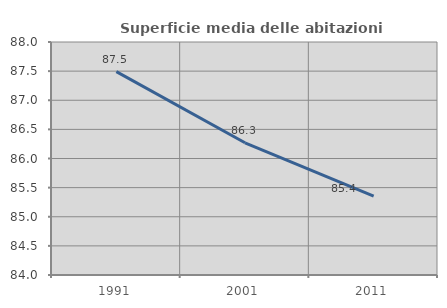
| Category | Superficie media delle abitazioni occupate |
|---|---|
| 1991.0 | 87.491 |
| 2001.0 | 86.27 |
| 2011.0 | 85.355 |